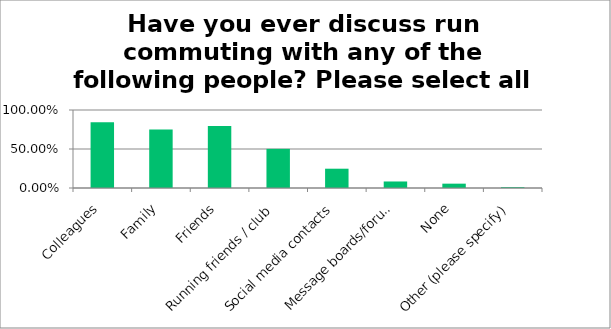
| Category | Responses |
|---|---|
| Colleagues | 0.843 |
| Family | 0.749 |
| Friends | 0.794 |
| Running friends / club | 0.502 |
| Social media contacts | 0.247 |
| Message boards/forums/chat rooms | 0.084 |
| None | 0.056 |
| Other (please specify) | 0.01 |